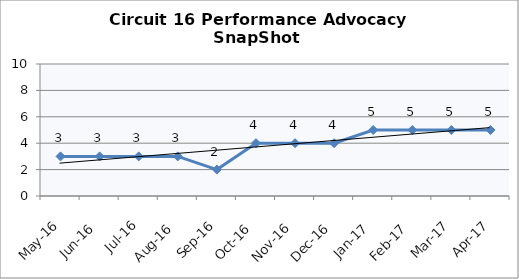
| Category | Circuit 16 |
|---|---|
| May-16 | 3 |
| Jun-16 | 3 |
| Jul-16 | 3 |
| Aug-16 | 3 |
| Sep-16 | 2 |
| Oct-16 | 4 |
| Nov-16 | 4 |
| Dec-16 | 4 |
| Jan-17 | 5 |
| Feb-17 | 5 |
| Mar-17 | 5 |
| Apr-17 | 5 |